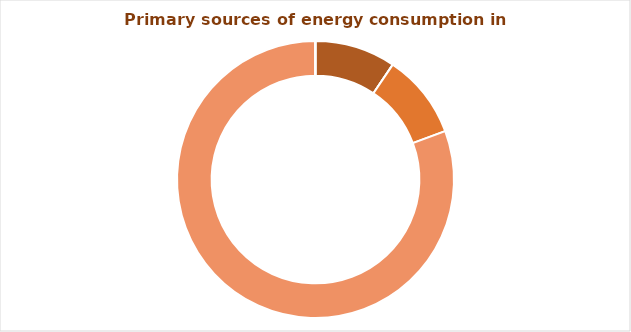
| Category | Series 0 |
|---|---|
| Hydro (1) | 0.094 |
| Biomass (1) | 0 |
| Natural gas | 0.099 |
| Diesel | 0.806 |
| Oil (1) | 0 |
| LPG | 0 |